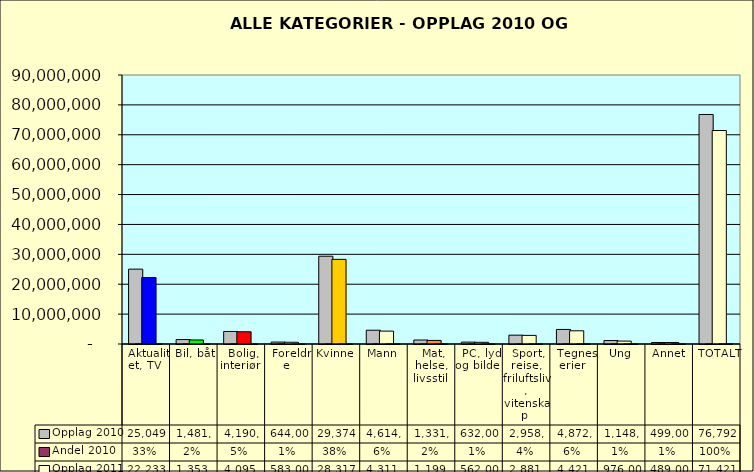
| Category | Opplag 2010 | Andel 2010 | Opplag 2011 | Andel 2011 |
|---|---|---|---|---|
| Aktualitet, TV | 25049000 | 0.326 | 22233000 | 0.311 |
| Bil, båt | 1481000 | 0.019 | 1353000 | 0.019 |
| Bolig, interiør | 4190000 | 0.055 | 4095000 | 0.057 |
| Foreldre | 644000 | 0.008 | 583000 | 0.008 |
| Kvinne | 29374000 | 0.383 | 28317000 | 0.396 |
| Mann | 4614000 | 0.06 | 4311000 | 0.06 |
| Mat, helse, livsstil | 1331000 | 0.017 | 1199000 | 0.017 |
| PC, lyd og bilde | 632000 | 0.008 | 562000 | 0.008 |
| Sport, reise, friluftsliv, vitenskap | 2958000 | 0.039 | 2881000 | 0.04 |
| Tegneserier | 4872000 | 0.063 | 4421000 | 0.062 |
| Ung | 1148000 | 0.015 | 976000 | 0.014 |
| Annet | 499000 | 0.006 | 489000 | 0.007 |
| TOTALT | 76792000 | 1 | 71421000 | 1 |